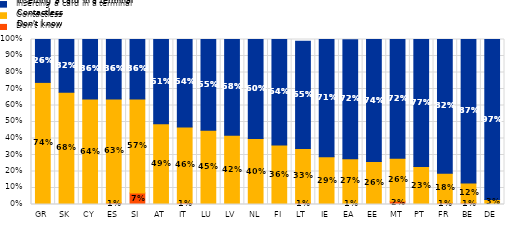
| Category | Don't know | Contactless | Inserting a card in a terminal |
|---|---|---|---|
| GR | 0 | 0.74 | 0.26 |
| SK | 0 | 0.68 | 0.32 |
| CY | 0 | 0.64 | 0.36 |
| ES | 0.01 | 0.63 | 0.36 |
| SI | 0.07 | 0.57 | 0.36 |
| AT | 0 | 0.49 | 0.51 |
| IT | 0.01 | 0.46 | 0.54 |
| LU | 0 | 0.45 | 0.55 |
| LV | 0 | 0.42 | 0.58 |
| NL | 0 | 0.4 | 0.6 |
| FI | 0 | 0.36 | 0.64 |
| LT | 0.01 | 0.33 | 0.65 |
| IE | 0 | 0.29 | 0.71 |
| EA | 0.005 | 0.273 | 0.72 |
| EE | 0 | 0.26 | 0.74 |
| MT | 0.02 | 0.26 | 0.72 |
| PT | 0 | 0.23 | 0.77 |
| FR | 0.01 | 0.18 | 0.82 |
| BE | 0.01 | 0.12 | 0.87 |
| DE | 0 | 0.03 | 0.97 |